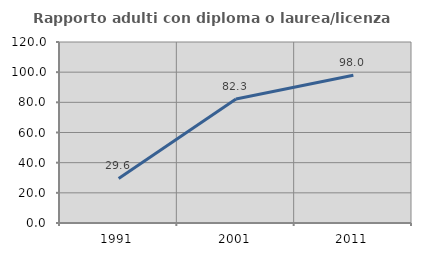
| Category | Rapporto adulti con diploma o laurea/licenza media  |
|---|---|
| 1991.0 | 29.577 |
| 2001.0 | 82.258 |
| 2011.0 | 97.959 |